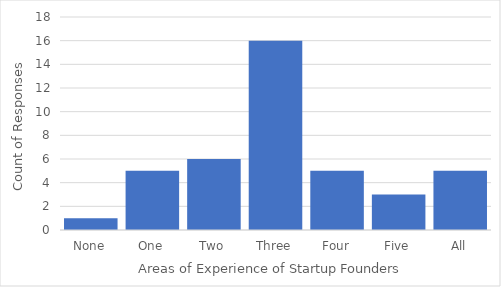
| Category | Series 0 |
|---|---|
| None | 1 |
| One | 5 |
| Two | 6 |
| Three | 16 |
| Four | 5 |
| Five | 3 |
| All | 5 |